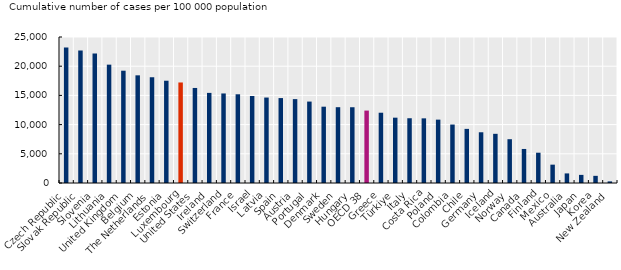
| Category | Cumulative cases per 100 000 population |
|---|---|
| Czech Republic | 23214.649 |
| Slovak Republic | 22668.51 |
| Slovenia | 22173.594 |
| Lithuania | 20265.338 |
| United Kingdom | 19229.617 |
| Belgium | 18436.819 |
| The Netherlands | 18108.777 |
| Estonia | 17514.067 |
| Luxembourg | 17212.831 |
| United States | 16273.227 |
| Ireland | 15430.304 |
| Switzerland | 15332.56 |
| France | 15191.413 |
| Israel | 14894.404 |
| Latvia | 14632.138 |
| Spain | 14542.392 |
| Austria | 14363.028 |
| Portugal | 13943.59 |
| Denmark | 13065.55 |
| Sweden | 12980.352 |
| Hungary | 12972.856 |
| OECD 38 | 12401 |
| Greece | 12033.423 |
| Türkiye | 11185.497 |
| Italy | 11088.187 |
| Costa Rica | 11070.251 |
| Poland | 10849.928 |
| Colombia | 10011.227 |
| Chile | 9267.311 |
| Germany | 8687.844 |
| Iceland | 8421.82 |
| Norway | 7499.858 |
| Canada | 5828.16 |
| Finland | 5186.569 |
| Mexico | 3140.933 |
| Australia | 1641.505 |
| Japan | 1390.146 |
| Korea | 1225.644 |
| New Zealand | 275.219 |